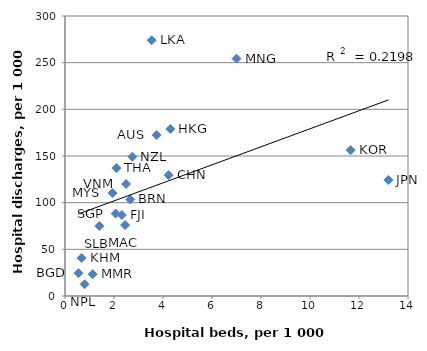
| Category | Series 0 |
|---|---|
| 3.74 | 172.397 |
| 0.55 | 24.43 |
| 2.663755458515284 | 103.4 |
| 0.68 | 40.68 |
| 4.23 | 129.553 |
| 2.32 | 86.75 |
| 4.3 | 178.9 |
| 13.2 | 124.386 |
| 11.66 | 156.337 |
| 2.4533045977011496 | 76 |
| 1.94 | 110.4 |
| 7.001072577761888 | 254.4 |
| 1.13 | 23.4 |
| 0.8 | 12.6 |
| 2.75 | 149.285 |
| 2.0682632472185554 | 88.34 |
| 1.4 | 75 |
| 3.54 | 274 |
| 2.1 | 137 |
| 2.49 | 120 |